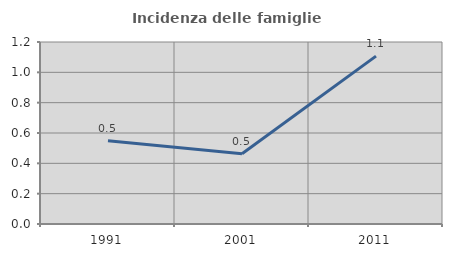
| Category | Incidenza delle famiglie numerose |
|---|---|
| 1991.0 | 0.548 |
| 2001.0 | 0.464 |
| 2011.0 | 1.107 |